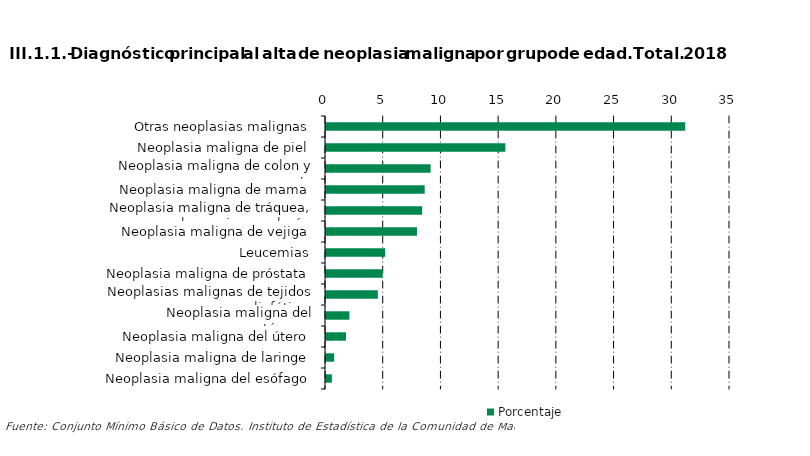
| Category | Porcentaje |
|---|---|
| Otras neoplasias malignas | 31.122 |
| Neoplasia maligna de piel | 15.542 |
| Neoplasia maligna de colon y recto | 9.062 |
| Neoplasia maligna de mama | 8.551 |
| Neoplasia maligna de tráquea, bronquios y pulmón | 8.331 |
| Neoplasia maligna de vejiga | 7.878 |
| Leucemias | 5.13 |
| Neoplasia maligna de próstata | 4.911 |
| Neoplasias malignas de tejidos linfáticos | 4.491 |
| Neoplasia maligna del estómago | 2.028 |
| Neoplasia maligna del útero | 1.735 |
| Neoplasia maligna de laringe | 0.708 |
| Neoplasia maligna del esófago | 0.511 |